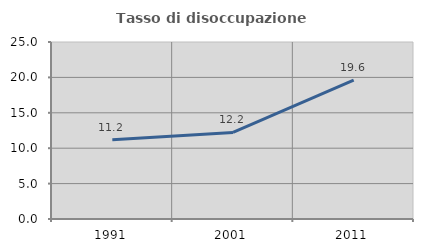
| Category | Tasso di disoccupazione giovanile  |
|---|---|
| 1991.0 | 11.194 |
| 2001.0 | 12.222 |
| 2011.0 | 19.608 |